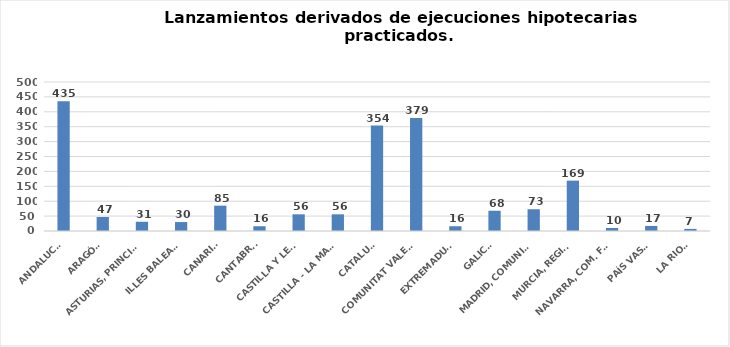
| Category | Series 0 |
|---|---|
| ANDALUCÍA | 435 |
| ARAGÓN | 47 |
| ASTURIAS, PRINCIPADO | 31 |
| ILLES BALEARS | 30 |
| CANARIAS | 85 |
| CANTABRIA | 16 |
| CASTILLA Y LEÓN | 56 |
| CASTILLA - LA MANCHA | 56 |
| CATALUÑA | 354 |
| COMUNITAT VALENCIANA | 379 |
| EXTREMADURA | 16 |
| GALICIA | 68 |
| MADRID, COMUNIDAD | 73 |
| MURCIA, REGIÓN | 169 |
| NAVARRA, COM. FORAL | 10 |
| PAÍS VASCO | 17 |
| LA RIOJA | 7 |